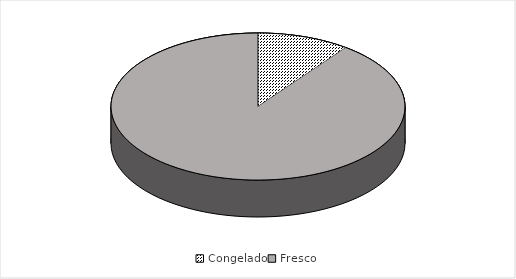
| Category | N° de indíviduos |
|---|---|
| Congelado | 5 |
| Fresco | 44 |